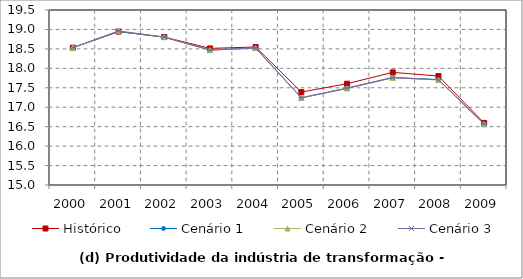
| Category | Histórico | Cenário 1 | Cenário 2 | Cenário 3 |
|---|---|---|---|---|
| 2000.0 | 18.532 | 18.532 | 18.532 | 18.532 |
| 2001.0 | 18.944 | 18.944 | 18.963 | 18.959 |
| 2002.0 | 18.805 | 18.801 | 18.801 | 18.801 |
| 2003.0 | 18.513 | 18.472 | 18.468 | 18.469 |
| 2004.0 | 18.548 | 18.528 | 18.518 | 18.521 |
| 2005.0 | 17.39 | 17.246 | 17.236 | 17.238 |
| 2006.0 | 17.604 | 17.493 | 17.482 | 17.485 |
| 2007.0 | 17.896 | 17.766 | 17.755 | 17.758 |
| 2008.0 | 17.801 | 17.712 | 17.701 | 17.704 |
| 2009.0 | 16.597 | 16.569 | 16.561 | 16.564 |